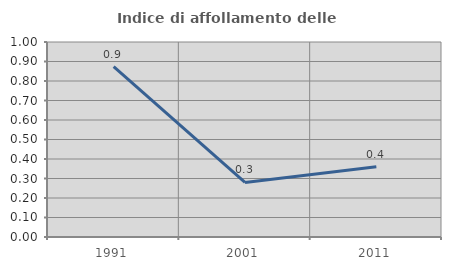
| Category | Indice di affollamento delle abitazioni  |
|---|---|
| 1991.0 | 0.874 |
| 2001.0 | 0.28 |
| 2011.0 | 0.36 |